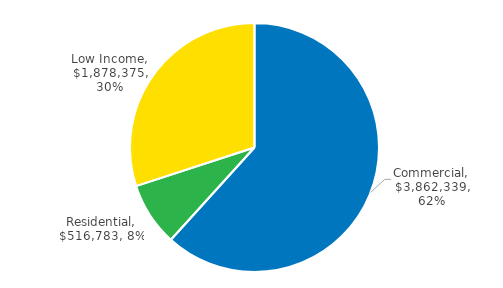
| Category | Series 0 |
|---|---|
| Commercial | 3862338.664 |
| Residential | 516782.931 |
| Low Income | 1878374.852 |